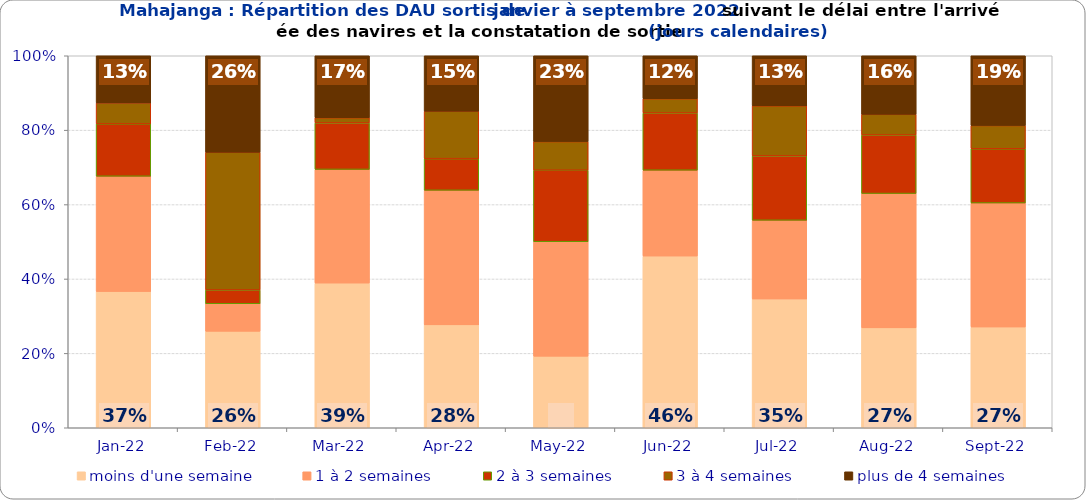
| Category | moins d'une semaine | 1 à 2 semaines | 2 à 3 semaines | 3 à 4 semaines | plus de 4 semaines |
|---|---|---|---|---|---|
| 2022-01-01 | 0.366 | 0.31 | 0.141 | 0.056 | 0.127 |
| 2022-02-01 | 0.259 | 0.074 | 0.037 | 0.37 | 0.259 |
| 2022-03-01 | 0.389 | 0.306 | 0.125 | 0.014 | 0.167 |
| 2022-04-01 | 0.277 | 0.362 | 0.085 | 0.128 | 0.149 |
| 2022-05-01 | 0.192 | 0.308 | 0.192 | 0.077 | 0.231 |
| 2022-06-01 | 0.462 | 0.231 | 0.154 | 0.038 | 0.115 |
| 2022-07-01 | 0.346 | 0.212 | 0.173 | 0.135 | 0.135 |
| 2022-08-01 | 0.269 | 0.361 | 0.157 | 0.056 | 0.157 |
| 2022-09-01 | 0.271 | 0.333 | 0.146 | 0.062 | 0.188 |